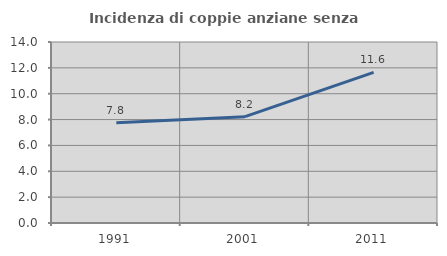
| Category | Incidenza di coppie anziane senza figli  |
|---|---|
| 1991.0 | 7.757 |
| 2001.0 | 8.227 |
| 2011.0 | 11.645 |